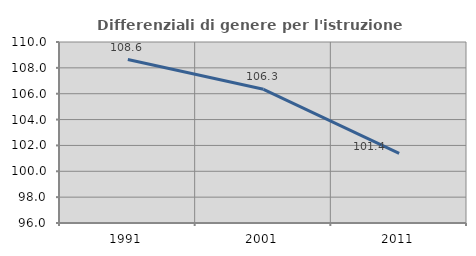
| Category | Differenziali di genere per l'istruzione superiore |
|---|---|
| 1991.0 | 108.646 |
| 2001.0 | 106.343 |
| 2011.0 | 101.383 |